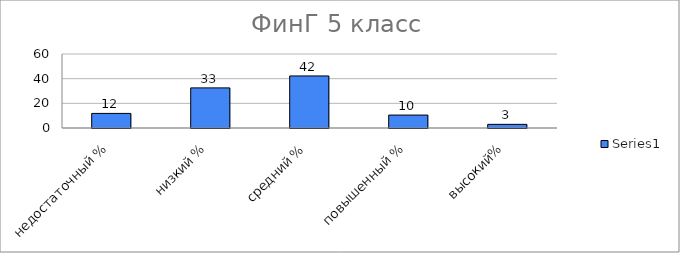
| Category | Series 0 |
|---|---|
| недостаточный % | 11.828 |
| низкий % | 32.527 |
| средний % | 42.204 |
| повышенный % | 10.484 |
| высокий% | 2.957 |